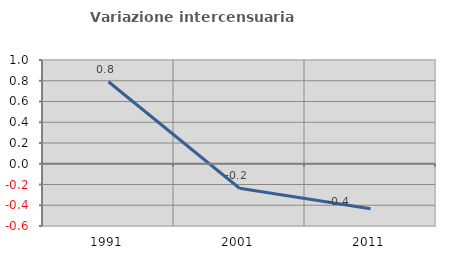
| Category | Variazione intercensuaria annua |
|---|---|
| 1991.0 | 0.791 |
| 2001.0 | -0.236 |
| 2011.0 | -0.434 |